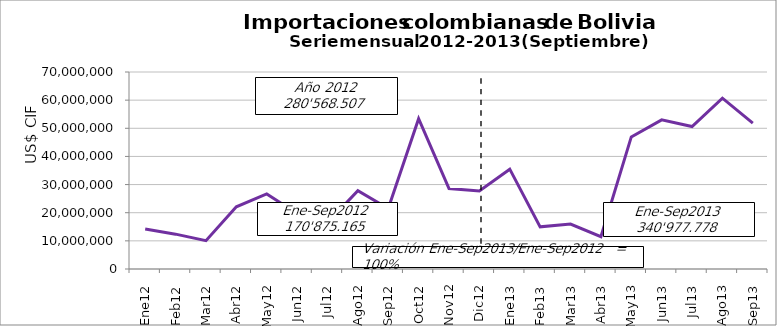
| Category | Series 0 |
|---|---|
| 0 | 14240832.58 |
| 1 | 12382585.39 |
| 2 | 10049296.16 |
| 3 | 22080509.24 |
| 4 | 26660110 |
| 5 | 19742921.9 |
| 6 | 16380227.31 |
| 7 | 27848584.91 |
| 8 | 21490097.97 |
| 9 | 53399911.67 |
| 10 | 28596200.82 |
| 11 | 27697229.54 |
| 12 | 35472679.02 |
| 13 | 14972189.06 |
| 14 | 15950167.89 |
| 15 | 11468960.22 |
| 16 | 46934047.72 |
| 17 | 52994883.29 |
| 18 | 50618380.86 |
| 19 | 60713012.71 |
| 20 | 51853456.87 |